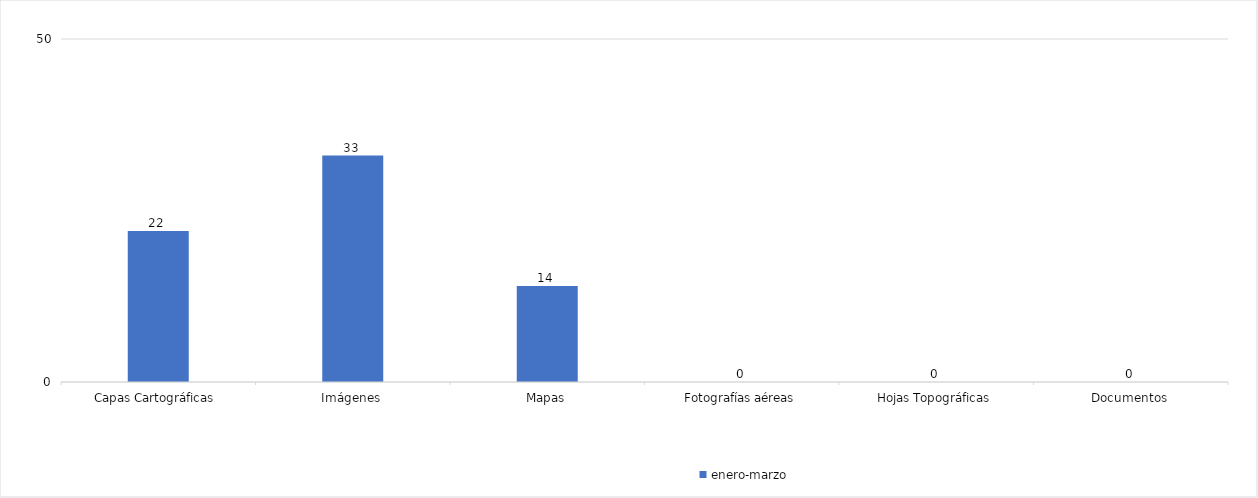
| Category | enero-marzo | abril-junio | julio-septiembre | octubre-diciembre |
|---|---|---|---|---|
| Capas Cartográficas  | 22 |  |  |  |
| Imágenes | 33 |  |  |  |
| Mapas | 14 |  |  |  |
| Fotografías aéreas | 0 |  |  |  |
| Hojas Topográficas | 0 |  |  |  |
| Documentos | 0 |  |  |  |